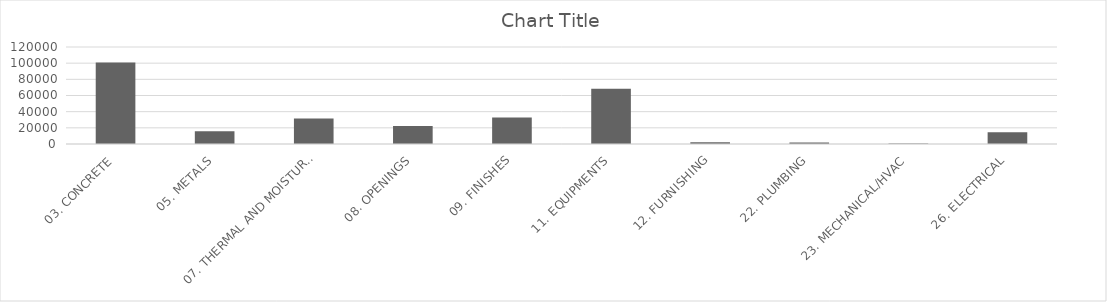
| Category | Series 0 | Series 1 | Series 2 | Series 3 | Series 4 | Series 5 | Series 6 | Series 7 | Series 8 |
|---|---|---|---|---|---|---|---|---|---|
| 03. CONCRETE |  |  |  |  |  |  |  |  | 100922.856 |
| 05. METALS |  |  |  |  |  |  |  |  | 15824.325 |
| 07. THERMAL AND MOISTURE CONDITIONS |  |  |  |  |  |  |  |  | 31481.2 |
| 08. OPENINGS |  |  |  |  |  |  |  |  | 22323 |
| 09. FINISHES |  |  |  |  |  |  |  |  | 32707.546 |
| 11. EQUIPMENTS |  |  |  |  |  |  |  |  | 68464.87 |
| 12. FURNISHING |  |  |  |  |  |  |  |  | 2013.14 |
| 22. PLUMBING |  |  |  |  |  |  |  |  | 1896.222 |
| 23. MECHANICAL/HVAC |  |  |  |  |  |  |  |  | 515 |
| 26. ELECTRICAL |  |  |  |  |  |  |  |  | 14663.2 |